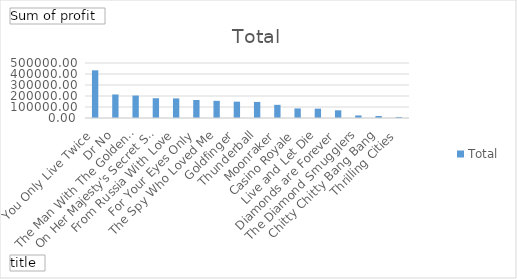
| Category | Total |
|---|---|
| You Only Live Twice | 433461.65 |
| Dr No | 213738.69 |
| The Man With The Golden Gun | 204172.72 |
| On Her Majesty's Secret Service | 179726.84 |
| From Russia With Love | 178250.06 |
| For Your Eyes Only | 163628.3 |
| The Spy Who Loved Me | 156209.34 |
| Goldfinger | 148385.39 |
| Thunderball | 146000.39 |
| Moonraker | 119696.95 |
| Casino Royale | 86940.23 |
| Live and Let Die | 85168 |
| Diamonds are Forever | 69958.91 |
| The Diamond Smugglers | 23211.66 |
| Chitty Chitty Bang Bang | 18228.73 |
| Thrilling Cities | 9410.58 |